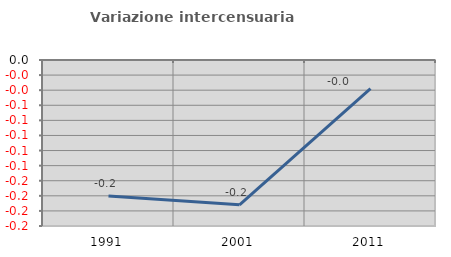
| Category | Variazione intercensuaria annua |
|---|---|
| 1991.0 | -0.18 |
| 2001.0 | -0.192 |
| 2011.0 | -0.038 |